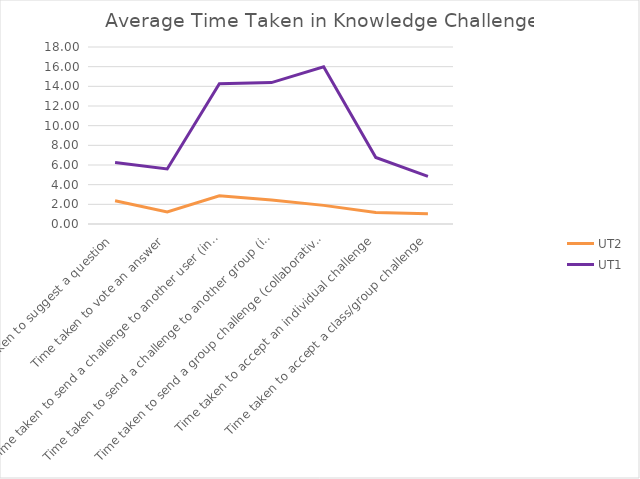
| Category | UT2 | UT1 |
|---|---|---|
| Time taken to suggest a question | 2.359 | 6.254 |
| Time taken to vote an answer | 1.232 | 5.594 |
| Time taken to send a challenge to another user (individual) | 2.869 | 14.27 |
| Time taken to send a challenge to another group (individual) | 2.447 | 14.381 |
| Time taken to send a group challenge (collaborative) | 1.894 | 15.997 |
| Time taken to accept an individual challenge | 1.178 | 6.761 |
| Time taken to accept a class/group challenge | 1.037 | 4.849 |